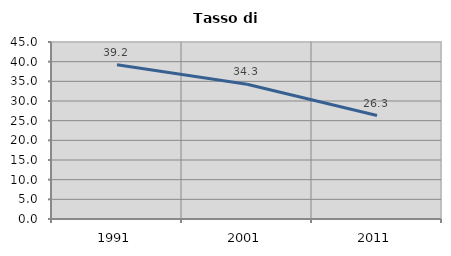
| Category | Tasso di disoccupazione   |
|---|---|
| 1991.0 | 39.193 |
| 2001.0 | 34.266 |
| 2011.0 | 26.297 |